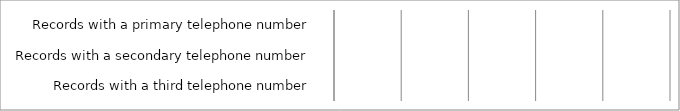
| Category | Series 0 |
|---|---|
|  Records with a primary telephone number  | 0 |
|  Records with a secondary telephone number  | 0 |
|  Records with a third telephone number  | 0 |